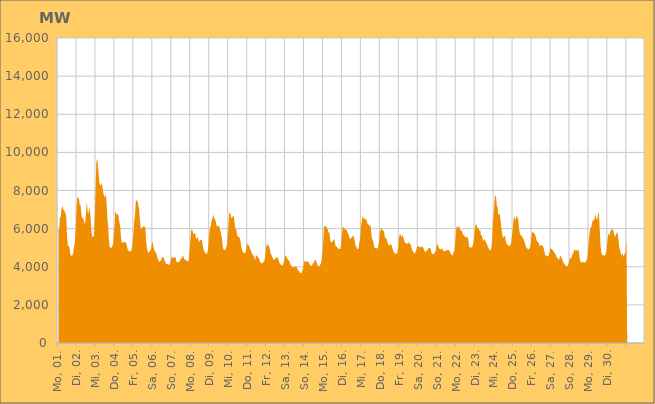
| Category | Series 0 |
|---|---|
|  Mo, 01.  | 5942.492 |
|  Mo, 01.  | 5971.502 |
|  Mo, 01.  | 6606.141 |
|  Mo, 01.  | 6618.14 |
|  Mo, 01.  | 7059.286 |
|  Mo, 01.  | 7218.735 |
|  Mo, 01.  | 6996.434 |
|  Mo, 01.  | 6989.589 |
|  Mo, 01.  | 6866.864 |
|  Mo, 01.  | 6834.698 |
|  Mo, 01.  | 6589.171 |
|  Mo, 01.  | 5536.341 |
|  Mo, 01.  | 5118.541 |
|  Mo, 01.  | 5095.171 |
|  Mo, 01.  | 4999.052 |
|  Mo, 01.  | 4667.155 |
|  Mo, 01.  | 4590.005 |
|  Di, 02.  | 4567.908 |
|  Di, 02.  | 4613.092 |
|  Di, 02.  | 4781.045 |
|  Di, 02.  | 5086.754 |
|  Di, 02.  | 5296.354 |
|  Di, 02.  | 6104.117 |
|  Di, 02.  | 7165.853 |
|  Di, 02.  | 7717.204 |
|  Di, 02.  | 7592.16 |
|  Di, 02.  | 7601.323 |
|  Di, 02.  | 7249.101 |
|  Di, 02.  | 7265.871 |
|  Di, 02.  | 6772.869 |
|  Di, 02.  | 6539.355 |
|  Di, 02.  | 6592.845 |
|  Di, 02.  | 6451.249 |
|  Di, 02.  | 6246.551 |
|  Di, 02.  | 6315.882 |
|  Di, 02.  | 6861 |
|  Di, 02.  | 7445.081 |
|  Di, 02.  | 6897.682 |
|  Di, 02.  | 6777.336 |
|  Di, 02.  | 7128.279 |
|  Di, 02.  | 6913.587 |
|  Mi, 03.  | 6363.155 |
|  Mi, 03.  | 5773.854 |
|  Mi, 03.  | 5547.683 |
|  Mi, 03.  | 5588.777 |
|  Mi, 03.  | 5609.288 |
|  Mi, 03.  | 6498.535 |
|  Mi, 03.  | 7991.657 |
|  Mi, 03.  | 9464.387 |
|  Mi, 03.  | 9678.128 |
|  Mi, 03.  | 9318.894 |
|  Mi, 03.  | 8834.391 |
|  Mi, 03.  | 8338.768 |
|  Mi, 03.  | 8291.321 |
|  Mi, 03.  | 8265.83 |
|  Mi, 03.  | 8432.034 |
|  Mi, 03.  | 8105.361 |
|  Mi, 03.  | 7819.681 |
|  Mi, 03.  | 7694.494 |
|  Mi, 03.  | 7620.033 |
|  Mi, 03.  | 7843.893 |
|  Mi, 03.  | 7379.189 |
|  Mi, 03.  | 6537.161 |
|  Mi, 03.  | 6104.753 |
|  Mi, 03.  | 5358.945 |
|  Do, 04.  | 5007.867 |
|  Do, 04.  | 5007.543 |
|  Do, 04.  | 4988.89 |
|  Do, 04.  | 5021.567 |
|  Do, 04.  | 5177.635 |
|  Do, 04.  | 5500.227 |
|  Do, 04.  | 6085.127 |
|  Do, 04.  | 6925.402 |
|  Do, 04.  | 6845.981 |
|  Do, 04.  | 6687.948 |
|  Do, 04.  | 6789.142 |
|  Do, 04.  | 6714.363 |
|  Do, 04.  | 6349.574 |
|  Do, 04.  | 6191.689 |
|  Do, 04.  | 5675.782 |
|  Do, 04.  | 5288.7 |
|  Do, 04.  | 5253.837 |
|  Do, 04.  | 5259.396 |
|  Do, 04.  | 5300.25 |
|  Do, 04.  | 5302.335 |
|  Do, 04.  | 5287.237 |
|  Do, 04.  | 5212.33 |
|  Do, 04.  | 5032.84 |
|  Do, 04.  | 4882.123 |
|  Fr, 05.  | 4837.038 |
|  Fr, 05.  | 4822.161 |
|  Fr, 05.  | 4795.976 |
|  Fr, 05.  | 4823.648 |
|  Fr, 05.  | 4973.917 |
|  Fr, 05.  | 5276.224 |
|  Fr, 05.  | 5781.503 |
|  Fr, 05.  | 6402.752 |
|  Fr, 05.  | 6738.496 |
|  Fr, 05.  | 7445.391 |
|  Fr, 05.  | 7491.506 |
|  Fr, 05.  | 7446.217 |
|  Fr, 05.  | 7288.616 |
|  Fr, 05.  | 7055.991 |
|  Fr, 05.  | 6527.178 |
|  Fr, 05.  | 6073.699 |
|  Fr, 05.  | 5970.546 |
|  Fr, 05.  | 6049.723 |
|  Fr, 05.  | 6134.85 |
|  Fr, 05.  | 6089.042 |
|  Fr, 05.  | 6114.487 |
|  Fr, 05.  | 6068.711 |
|  Fr, 05.  | 5398.091 |
|  Fr, 05.  | 5012.143 |
|  Sa, 06.  | 4835.822 |
|  Sa, 06.  | 4690.556 |
|  Sa, 06.  | 4793.334 |
|  Sa, 06.  | 4841.749 |
|  Sa, 06.  | 4878.652 |
|  Sa, 06.  | 5082.123 |
|  Sa, 06.  | 5336.017 |
|  Sa, 06.  | 5116.762 |
|  Sa, 06.  | 4916.292 |
|  Sa, 06.  | 4805.537 |
|  Sa, 06.  | 4790.729 |
|  Sa, 06.  | 4700.802 |
|  Sa, 06.  | 4534.475 |
|  Sa, 06.  | 4413.053 |
|  Sa, 06.  | 4278.727 |
|  Sa, 06.  | 4260.705 |
|  Sa, 06.  | 4291.868 |
|  Sa, 06.  | 4368.474 |
|  Sa, 06.  | 4456.692 |
|  Sa, 06.  | 4522.059 |
|  Sa, 06.  | 4497.177 |
|  Sa, 06.  | 4391.26 |
|  Sa, 06.  | 4263.929 |
|  Sa, 06.  | 4185.667 |
|  So, 07.  | 4138.052 |
|  So, 07.  | 4143.319 |
|  So, 07.  | 4122.097 |
|  So, 07.  | 4091.152 |
|  So, 07.  | 4141.451 |
|  So, 07.  | 4239.894 |
|  So, 07.  | 4461.157 |
|  So, 07.  | 4541.715 |
|  So, 07.  | 4469.605 |
|  So, 07.  | 4466.583 |
|  So, 07.  | 4481.013 |
|  So, 07.  | 4520.495 |
|  So, 07.  | 4346.289 |
|  So, 07.  | 4200.491 |
|  So, 07.  | 4260.488 |
|  So, 07.  | 4252.79 |
|  So, 07.  | 4246.53 |
|  So, 07.  | 4324.064 |
|  So, 07.  | 4413.902 |
|  So, 07.  | 4430.646 |
|  So, 07.  | 4553.383 |
|  So, 07.  | 4572.478 |
|  So, 07.  | 4423.401 |
|  So, 07.  | 4370.418 |
|  Mo, 08.  | 4374.806 |
|  Mo, 08.  | 4328.856 |
|  Mo, 08.  | 4282.881 |
|  Mo, 08.  | 4279.235 |
|  Mo, 08.  | 4361.159 |
|  Mo, 08.  | 4789.968 |
|  Mo, 08.  | 5338.361 |
|  Mo, 08.  | 5871.986 |
|  Mo, 08.  | 5976.758 |
|  Mo, 08.  | 5855.171 |
|  Mo, 08.  | 5721.663 |
|  Mo, 08.  | 5733.538 |
|  Mo, 08.  | 5784.654 |
|  Mo, 08.  | 5550.455 |
|  Mo, 08.  | 5424.586 |
|  Mo, 08.  | 5580.292 |
|  Mo, 08.  | 5462.36 |
|  Mo, 08.  | 5285.853 |
|  Mo, 08.  | 5378.577 |
|  Mo, 08.  | 5420.252 |
|  Mo, 08.  | 5426.515 |
|  Mo, 08.  | 5323.207 |
|  Mo, 08.  | 5052.797 |
|  Mo, 08.  | 4864.477 |
|  Di, 09.  | 4793.107 |
|  Di, 09.  | 4710.747 |
|  Di, 09.  | 4660.708 |
|  Di, 09.  | 4700.598 |
|  Di, 09.  | 4795.239 |
|  Di, 09.  | 5170.933 |
|  Di, 09.  | 5746.156 |
|  Di, 09.  | 6087.41 |
|  Di, 09.  | 6141.444 |
|  Di, 09.  | 6440.379 |
|  Di, 09.  | 6516.976 |
|  Di, 09.  | 6759.104 |
|  Di, 09.  | 6562.792 |
|  Di, 09.  | 6517.989 |
|  Di, 09.  | 6410.72 |
|  Di, 09.  | 6212.608 |
|  Di, 09.  | 6079.993 |
|  Di, 09.  | 6135.29 |
|  Di, 09.  | 6160.485 |
|  Di, 09.  | 6061.997 |
|  Di, 09.  | 5860.759 |
|  Di, 09.  | 5726.621 |
|  Di, 09.  | 5499.364 |
|  Di, 09.  | 5066.383 |
|  Mi, 10.  | 4896.413 |
|  Mi, 10.  | 4911.049 |
|  Mi, 10.  | 4869.653 |
|  Mi, 10.  | 4963.487 |
|  Mi, 10.  | 5092.802 |
|  Mi, 10.  | 5396.462 |
|  Mi, 10.  | 5946.699 |
|  Mi, 10.  | 6731.414 |
|  Mi, 10.  | 6877.992 |
|  Mi, 10.  | 6759.443 |
|  Mi, 10.  | 6548.643 |
|  Mi, 10.  | 6557.975 |
|  Mi, 10.  | 6657.966 |
|  Mi, 10.  | 6656.463 |
|  Mi, 10.  | 6318.017 |
|  Mi, 10.  | 5935.893 |
|  Mi, 10.  | 6071.167 |
|  Mi, 10.  | 5704.396 |
|  Mi, 10.  | 5592.404 |
|  Mi, 10.  | 5555.879 |
|  Mi, 10.  | 5552.881 |
|  Mi, 10.  | 5455.348 |
|  Mi, 10.  | 5224.83 |
|  Mi, 10.  | 4969.587 |
|  Do, 11.  | 4804.171 |
|  Do, 11.  | 4754.92 |
|  Do, 11.  | 4724.089 |
|  Do, 11.  | 4696.604 |
|  Do, 11.  | 4780.181 |
|  Do, 11.  | 4954.375 |
|  Do, 11.  | 5271.673 |
|  Do, 11.  | 5107.106 |
|  Do, 11.  | 5149.754 |
|  Do, 11.  | 5007.472 |
|  Do, 11.  | 4911.18 |
|  Do, 11.  | 4813.457 |
|  Do, 11.  | 4678.2 |
|  Do, 11.  | 4658.257 |
|  Do, 11.  | 4581.712 |
|  Do, 11.  | 4505.72 |
|  Do, 11.  | 4311.995 |
|  Do, 11.  | 4604.209 |
|  Do, 11.  | 4588.696 |
|  Do, 11.  | 4533.628 |
|  Do, 11.  | 4477.336 |
|  Do, 11.  | 4441.395 |
|  Do, 11.  | 4262.481 |
|  Do, 11.  | 4193.973 |
|  Fr, 12.  | 4220.211 |
|  Fr, 12.  | 4162.087 |
|  Fr, 12.  | 4211.079 |
|  Fr, 12.  | 4301.74 |
|  Fr, 12.  | 4355.613 |
|  Fr, 12.  | 4561.271 |
|  Fr, 12.  | 5023.066 |
|  Fr, 12.  | 5163.086 |
|  Fr, 12.  | 5161.337 |
|  Fr, 12.  | 5108.734 |
|  Fr, 12.  | 5024.296 |
|  Fr, 12.  | 4845.855 |
|  Fr, 12.  | 4657.739 |
|  Fr, 12.  | 4591.62 |
|  Fr, 12.  | 4484.105 |
|  Fr, 12.  | 4388.387 |
|  Fr, 12.  | 4357.882 |
|  Fr, 12.  | 4411.705 |
|  Fr, 12.  | 4442.446 |
|  Fr, 12.  | 4489.353 |
|  Fr, 12.  | 4502.621 |
|  Fr, 12.  | 4432.58 |
|  Fr, 12.  | 4314.377 |
|  Fr, 12.  | 4182.251 |
|  Sa, 13.  | 4119.651 |
|  Sa, 13.  | 4111.941 |
|  Sa, 13.  | 4046.235 |
|  Sa, 13.  | 4082.159 |
|  Sa, 13.  | 4201.277 |
|  Sa, 13.  | 4359.266 |
|  Sa, 13.  | 4607.418 |
|  Sa, 13.  | 4535.184 |
|  Sa, 13.  | 4500.033 |
|  Sa, 13.  | 4406.473 |
|  Sa, 13.  | 4348.282 |
|  Sa, 13.  | 4328.279 |
|  Sa, 13.  | 4205.796 |
|  Sa, 13.  | 4096.078 |
|  Sa, 13.  | 4040.393 |
|  Sa, 13.  | 4002.619 |
|  Sa, 13.  | 3954.86 |
|  Sa, 13.  | 3965.276 |
|  Sa, 13.  | 4016.022 |
|  Sa, 13.  | 3992.061 |
|  Sa, 13.  | 4014.996 |
|  Sa, 13.  | 3949.531 |
|  Sa, 13.  | 3818.975 |
|  Sa, 13.  | 3797.591 |
|  So, 14.  | 3748.87 |
|  So, 14.  | 3675.825 |
|  So, 14.  | 3662.762 |
|  So, 14.  | 3707.403 |
|  So, 14.  | 3821.031 |
|  So, 14.  | 3971.486 |
|  So, 14.  | 4200.512 |
|  So, 14.  | 4337.157 |
|  So, 14.  | 4262.136 |
|  So, 14.  | 4261.736 |
|  So, 14.  | 4294.5 |
|  So, 14.  | 4271.781 |
|  So, 14.  | 4202.249 |
|  So, 14.  | 4131.878 |
|  So, 14.  | 4073.993 |
|  So, 14.  | 4030.547 |
|  So, 14.  | 4057.738 |
|  So, 14.  | 4176.858 |
|  So, 14.  | 4210.09 |
|  So, 14.  | 4268.623 |
|  So, 14.  | 4360.309 |
|  So, 14.  | 4354.202 |
|  So, 14.  | 4202.147 |
|  So, 14.  | 4079.198 |
|  Mo, 15.  | 4034.764 |
|  Mo, 15.  | 4001.206 |
|  Mo, 15.  | 4087.358 |
|  Mo, 15.  | 4142.809 |
|  Mo, 15.  | 4283.452 |
|  Mo, 15.  | 4663.311 |
|  Mo, 15.  | 5134.523 |
|  Mo, 15.  | 6034.189 |
|  Mo, 15.  | 6127.028 |
|  Mo, 15.  | 6140.818 |
|  Mo, 15.  | 6087.295 |
|  Mo, 15.  | 6060.506 |
|  Mo, 15.  | 5929.936 |
|  Mo, 15.  | 5794.852 |
|  Mo, 15.  | 5788.146 |
|  Mo, 15.  | 5424.021 |
|  Mo, 15.  | 5284.892 |
|  Mo, 15.  | 5274.77 |
|  Mo, 15.  | 5328.407 |
|  Mo, 15.  | 5411.795 |
|  Mo, 15.  | 5474.768 |
|  Mo, 15.  | 5289.011 |
|  Mo, 15.  | 5061.588 |
|  Mo, 15.  | 5054.452 |
|  Di, 16.  | 5008.559 |
|  Di, 16.  | 4952.747 |
|  Di, 16.  | 4959.099 |
|  Di, 16.  | 4913.957 |
|  Di, 16.  | 4952.708 |
|  Di, 16.  | 5227.35 |
|  Di, 16.  | 5716.566 |
|  Di, 16.  | 6109.994 |
|  Di, 16.  | 6069.414 |
|  Di, 16.  | 5985.48 |
|  Di, 16.  | 5959.871 |
|  Di, 16.  | 5938.708 |
|  Di, 16.  | 5938.824 |
|  Di, 16.  | 5772.564 |
|  Di, 16.  | 5723.869 |
|  Di, 16.  | 5574.292 |
|  Di, 16.  | 5481.175 |
|  Di, 16.  | 5444.616 |
|  Di, 16.  | 5539.978 |
|  Di, 16.  | 5564.797 |
|  Di, 16.  | 5653.397 |
|  Di, 16.  | 5590.495 |
|  Di, 16.  | 5397.108 |
|  Di, 16.  | 5126.835 |
|  Mi, 17.  | 5064.792 |
|  Mi, 17.  | 4930.491 |
|  Mi, 17.  | 4919.823 |
|  Mi, 17.  | 4971.831 |
|  Mi, 17.  | 5315.157 |
|  Mi, 17.  | 5460.838 |
|  Mi, 17.  | 6095.759 |
|  Mi, 17.  | 6366.038 |
|  Mi, 17.  | 6699.92 |
|  Mi, 17.  | 6520.242 |
|  Mi, 17.  | 6527.616 |
|  Mi, 17.  | 6585.27 |
|  Mi, 17.  | 6443.943 |
|  Mi, 17.  | 6462.834 |
|  Mi, 17.  | 6269.241 |
|  Mi, 17.  | 6243.374 |
|  Mi, 17.  | 6183.698 |
|  Mi, 17.  | 6136.44 |
|  Mi, 17.  | 6189.536 |
|  Mi, 17.  | 5785.698 |
|  Mi, 17.  | 5453.373 |
|  Mi, 17.  | 5418.429 |
|  Mi, 17.  | 5230.064 |
|  Mi, 17.  | 5022.302 |
|  Do, 18.  | 4976.216 |
|  Do, 18.  | 4981.944 |
|  Do, 18.  | 4963.907 |
|  Do, 18.  | 4962.919 |
|  Do, 18.  | 5097.544 |
|  Do, 18.  | 5358.54 |
|  Do, 18.  | 5840.925 |
|  Do, 18.  | 5933.808 |
|  Do, 18.  | 6062.562 |
|  Do, 18.  | 5932.806 |
|  Do, 18.  | 5867.775 |
|  Do, 18.  | 5907.894 |
|  Do, 18.  | 5590.179 |
|  Do, 18.  | 5502.181 |
|  Do, 18.  | 5486.459 |
|  Do, 18.  | 5380.793 |
|  Do, 18.  | 5197.853 |
|  Do, 18.  | 5124.887 |
|  Do, 18.  | 5128.927 |
|  Do, 18.  | 5178.612 |
|  Do, 18.  | 5188.616 |
|  Do, 18.  | 5097.901 |
|  Do, 18.  | 4935.163 |
|  Do, 18.  | 4817.406 |
|  Fr, 19.  | 4724.137 |
|  Fr, 19.  | 4691.486 |
|  Fr, 19.  | 4698.892 |
|  Fr, 19.  | 4659.32 |
|  Fr, 19.  | 4728.611 |
|  Fr, 19.  | 4971.235 |
|  Fr, 19.  | 5445.313 |
|  Fr, 19.  | 5707.385 |
|  Fr, 19.  | 5685.735 |
|  Fr, 19.  | 5582.134 |
|  Fr, 19.  | 5585.269 |
|  Fr, 19.  | 5675.115 |
|  Fr, 19.  | 5464.839 |
|  Fr, 19.  | 5336.09 |
|  Fr, 19.  | 5232.588 |
|  Fr, 19.  | 5250.55 |
|  Fr, 19.  | 5211.475 |
|  Fr, 19.  | 5203.155 |
|  Fr, 19.  | 5294.812 |
|  Fr, 19.  | 5242.857 |
|  Fr, 19.  | 5179.352 |
|  Fr, 19.  | 5156.104 |
|  Fr, 19.  | 4970.64 |
|  Fr, 19.  | 4833.869 |
|  Sa, 20.  | 4830.351 |
|  Sa, 20.  | 4713.548 |
|  Sa, 20.  | 4705.319 |
|  Sa, 20.  | 4745.549 |
|  Sa, 20.  | 4873.308 |
|  Sa, 20.  | 5035.528 |
|  Sa, 20.  | 5060.05 |
|  Sa, 20.  | 5089.485 |
|  Sa, 20.  | 5044.476 |
|  Sa, 20.  | 5009.068 |
|  Sa, 20.  | 5039.553 |
|  Sa, 20.  | 5060.664 |
|  Sa, 20.  | 5063.315 |
|  Sa, 20.  | 4975.735 |
|  Sa, 20.  | 4868.877 |
|  Sa, 20.  | 4783.378 |
|  Sa, 20.  | 4741.145 |
|  Sa, 20.  | 4842.675 |
|  Sa, 20.  | 4880.187 |
|  Sa, 20.  | 4943.351 |
|  Sa, 20.  | 4966.919 |
|  Sa, 20.  | 5017.527 |
|  Sa, 20.  | 4960.488 |
|  Sa, 20.  | 4781.249 |
|  So, 21.  | 4675.575 |
|  So, 21.  | 4672.01 |
|  So, 21.  | 4652.828 |
|  So, 21.  | 4722.051 |
|  So, 21.  | 4769.657 |
|  So, 21.  | 4858.936 |
|  So, 21.  | 5153.928 |
|  So, 21.  | 5195.13 |
|  So, 21.  | 5042.386 |
|  So, 21.  | 4975.21 |
|  So, 21.  | 4892.355 |
|  So, 21.  | 4916.304 |
|  So, 21.  | 4961.023 |
|  So, 21.  | 4942.003 |
|  So, 21.  | 4834.51 |
|  So, 21.  | 4833.39 |
|  So, 21.  | 4819.797 |
|  So, 21.  | 4816.329 |
|  So, 21.  | 4884.27 |
|  So, 21.  | 4884.215 |
|  So, 21.  | 4860.859 |
|  So, 21.  | 4896.604 |
|  So, 21.  | 4836.657 |
|  So, 21.  | 4727.89 |
|  Mo, 22.  | 4654.779 |
|  Mo, 22.  | 4628.615 |
|  Mo, 22.  | 4574.957 |
|  Mo, 22.  | 4787.587 |
|  Mo, 22.  | 4792.803 |
|  Mo, 22.  | 5144.813 |
|  Mo, 22.  | 5707.083 |
|  Mo, 22.  | 6115.029 |
|  Mo, 22.  | 6065.831 |
|  Mo, 22.  | 6058.83 |
|  Mo, 22.  | 6151.231 |
|  Mo, 22.  | 6018.538 |
|  Mo, 22.  | 5893.777 |
|  Mo, 22.  | 5925.077 |
|  Mo, 22.  | 5828.681 |
|  Mo, 22.  | 5687.79 |
|  Mo, 22.  | 5673.044 |
|  Mo, 22.  | 5591.99 |
|  Mo, 22.  | 5578.217 |
|  Mo, 22.  | 5529.569 |
|  Mo, 22.  | 5504.502 |
|  Mo, 22.  | 5614.731 |
|  Mo, 22.  | 5364.609 |
|  Mo, 22.  | 5016.633 |
|  Di, 23.  | 5024.252 |
|  Di, 23.  | 5003.426 |
|  Di, 23.  | 5009.12 |
|  Di, 23.  | 5056.547 |
|  Di, 23.  | 5182.492 |
|  Di, 23.  | 5477.224 |
|  Di, 23.  | 5905.104 |
|  Di, 23.  | 6199.339 |
|  Di, 23.  | 6258.616 |
|  Di, 23.  | 6090.285 |
|  Di, 23.  | 5979.605 |
|  Di, 23.  | 6027.876 |
|  Di, 23.  | 5864.58 |
|  Di, 23.  | 5917.551 |
|  Di, 23.  | 5606.214 |
|  Di, 23.  | 5666.236 |
|  Di, 23.  | 5474.746 |
|  Di, 23.  | 5335.821 |
|  Di, 23.  | 5465.672 |
|  Di, 23.  | 5401.3 |
|  Di, 23.  | 5296.51 |
|  Di, 23.  | 5205.569 |
|  Di, 23.  | 5120.861 |
|  Di, 23.  | 5012.15 |
|  Mi, 24.  | 4937.64 |
|  Mi, 24.  | 4890.473 |
|  Mi, 24.  | 4837.737 |
|  Mi, 24.  | 4974.689 |
|  Mi, 24.  | 5438.989 |
|  Mi, 24.  | 6317.456 |
|  Mi, 24.  | 6784.483 |
|  Mi, 24.  | 7465.044 |
|  Mi, 24.  | 7780.087 |
|  Mi, 24.  | 7635.466 |
|  Mi, 24.  | 7205.408 |
|  Mi, 24.  | 7086.544 |
|  Mi, 24.  | 6713.61 |
|  Mi, 24.  | 6781.675 |
|  Mi, 24.  | 6670.738 |
|  Mi, 24.  | 6308.353 |
|  Mi, 24.  | 5941.888 |
|  Mi, 24.  | 5645.835 |
|  Mi, 24.  | 5513.725 |
|  Mi, 24.  | 5598.982 |
|  Mi, 24.  | 5627.113 |
|  Mi, 24.  | 5429.121 |
|  Mi, 24.  | 5240.135 |
|  Mi, 24.  | 5189.974 |
|  Do, 25.  | 5141.601 |
|  Do, 25.  | 5090.872 |
|  Do, 25.  | 5077.792 |
|  Do, 25.  | 5145.798 |
|  Do, 25.  | 5237.645 |
|  Do, 25.  | 5579.586 |
|  Do, 25.  | 5932.604 |
|  Do, 25.  | 6422.334 |
|  Do, 25.  | 6594.909 |
|  Do, 25.  | 6580.089 |
|  Do, 25.  | 6384.241 |
|  Do, 25.  | 6717.976 |
|  Do, 25.  | 6606.863 |
|  Do, 25.  | 6477.033 |
|  Do, 25.  | 6003.051 |
|  Do, 25.  | 5770.141 |
|  Do, 25.  | 5645.802 |
|  Do, 25.  | 5641.767 |
|  Do, 25.  | 5591.176 |
|  Do, 25.  | 5485.581 |
|  Do, 25.  | 5431.388 |
|  Do, 25.  | 5299.556 |
|  Do, 25.  | 5179.875 |
|  Do, 25.  | 4982.276 |
|  Fr, 26.  | 5014.842 |
|  Fr, 26.  | 4925.212 |
|  Fr, 26.  | 4897.82 |
|  Fr, 26.  | 4951.481 |
|  Fr, 26.  | 5009.11 |
|  Fr, 26.  | 5231.552 |
|  Fr, 26.  | 5719.127 |
|  Fr, 26.  | 5826.263 |
|  Fr, 26.  | 5810.238 |
|  Fr, 26.  | 5746.264 |
|  Fr, 26.  | 5724.618 |
|  Fr, 26.  | 5586.854 |
|  Fr, 26.  | 5432.31 |
|  Fr, 26.  | 5313.477 |
|  Fr, 26.  | 5265.95 |
|  Fr, 26.  | 5270.453 |
|  Fr, 26.  | 5069.355 |
|  Fr, 26.  | 5125.308 |
|  Fr, 26.  | 5131.675 |
|  Fr, 26.  | 5116.818 |
|  Fr, 26.  | 5107.369 |
|  Fr, 26.  | 4994.732 |
|  Fr, 26.  | 4843.685 |
|  Fr, 26.  | 4644.118 |
|  Sa, 27.  | 4578.365 |
|  Sa, 27.  | 4569.998 |
|  Sa, 27.  | 4542.417 |
|  Sa, 27.  | 4548.697 |
|  Sa, 27.  | 4631.003 |
|  Sa, 27.  | 4799.207 |
|  Sa, 27.  | 5010.971 |
|  Sa, 27.  | 4931.873 |
|  Sa, 27.  | 4913.912 |
|  Sa, 27.  | 4836.976 |
|  Sa, 27.  | 4813.738 |
|  Sa, 27.  | 4714.629 |
|  Sa, 27.  | 4675.925 |
|  Sa, 27.  | 4581.673 |
|  Sa, 27.  | 4480.242 |
|  Sa, 27.  | 4443.171 |
|  Sa, 27.  | 4351.105 |
|  Sa, 27.  | 4417.099 |
|  Sa, 27.  | 4559.953 |
|  Sa, 27.  | 4543.153 |
|  Sa, 27.  | 4449.066 |
|  Sa, 27.  | 4353.817 |
|  Sa, 27.  | 4259.443 |
|  Sa, 27.  | 4133.886 |
|  So, 28.  | 4123.342 |
|  So, 28.  | 4056.275 |
|  So, 28.  | 4006.637 |
|  So, 28.  | 4026.984 |
|  So, 28.  | 4056.656 |
|  So, 28.  | 4180.779 |
|  So, 28.  | 4393.468 |
|  So, 28.  | 4452.886 |
|  So, 28.  | 4434.591 |
|  So, 28.  | 4559.468 |
|  So, 28.  | 4679.295 |
|  So, 28.  | 4729.504 |
|  So, 28.  | 4929.926 |
|  So, 28.  | 4863.337 |
|  So, 28.  | 4820.785 |
|  So, 28.  | 4892.821 |
|  So, 28.  | 4827.3 |
|  So, 28.  | 4907.599 |
|  So, 28.  | 4738.537 |
|  So, 28.  | 4385.505 |
|  So, 28.  | 4229.169 |
|  So, 28.  | 4229.326 |
|  So, 28.  | 4259.04 |
|  So, 28.  | 4217.209 |
|  Mo, 29.  | 4257.785 |
|  Mo, 29.  | 4220.463 |
|  Mo, 29.  | 4245.001 |
|  Mo, 29.  | 4280.559 |
|  Mo, 29.  | 4400.512 |
|  Mo, 29.  | 4628.469 |
|  Mo, 29.  | 5152.94 |
|  Mo, 29.  | 5629.588 |
|  Mo, 29.  | 5970.965 |
|  Mo, 29.  | 6048.556 |
|  Mo, 29.  | 6156.517 |
|  Mo, 29.  | 6404.375 |
|  Mo, 29.  | 6434.786 |
|  Mo, 29.  | 6436.113 |
|  Mo, 29.  | 6606.344 |
|  Mo, 29.  | 6752.372 |
|  Mo, 29.  | 6492.945 |
|  Mo, 29.  | 6464.353 |
|  Mo, 29.  | 6764.13 |
|  Mo, 29.  | 6894.244 |
|  Mo, 29.  | 6143.731 |
|  Mo, 29.  | 5239.689 |
|  Mo, 29.  | 4822.026 |
|  Mo, 29.  | 4657.579 |
|  Di, 30.  | 4590.544 |
|  Di, 30.  | 4625.117 |
|  Di, 30.  | 4559.018 |
|  Di, 30.  | 4595.755 |
|  Di, 30.  | 4722.133 |
|  Di, 30.  | 4920.948 |
|  Di, 30.  | 5391.931 |
|  Di, 30.  | 5759.858 |
|  Di, 30.  | 5660.547 |
|  Di, 30.  | 5692.012 |
|  Di, 30.  | 5905.831 |
|  Di, 30.  | 5940.601 |
|  Di, 30.  | 5987.817 |
|  Di, 30.  | 5933.413 |
|  Di, 30.  | 5787.407 |
|  Di, 30.  | 5596.732 |
|  Di, 30.  | 5591.425 |
|  Di, 30.  | 5708.14 |
|  Di, 30.  | 5819.703 |
|  Di, 30.  | 5730.958 |
|  Di, 30.  | 5361.789 |
|  Di, 30.  | 4990.581 |
|  Di, 30.  | 4852.951 |
|  Di, 30.  | 4670.211 |
|  Mi, 01.  | 4592.551 |
|  Mi, 01.  | 4718.164 |
|  Mi, 01.  | 4504.169 |
|  Mi, 01.  | 4640.859 |
|  Mi, 01.  | 4677.361 |
|  Mi, 01.  | 4800.688 |
|    | 5555.679 |
|    | 0 |
|    | 0 |
|    | 0 |
|    | 0 |
|    | 0 |
|    | 0 |
|    | 0 |
|    | 0 |
|    | 0 |
|    | 0 |
|    | 0 |
|    | 0 |
|    | 0 |
|    | 0 |
|    | 0 |
|    | 0 |
|    | 0 |
|    | 0 |
|    | 0 |
|    | 0 |
|    | 0 |
|    | 0 |
|    | 0 |